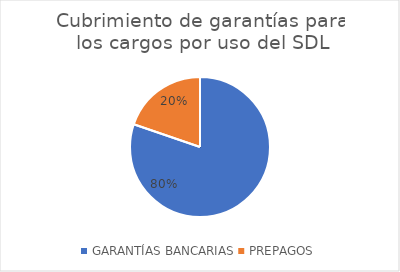
| Category | SUMA |
|---|---|
| GARANTÍAS BANCARIAS | 576967040377.934 |
| PREPAGOS | 141920732338.97 |